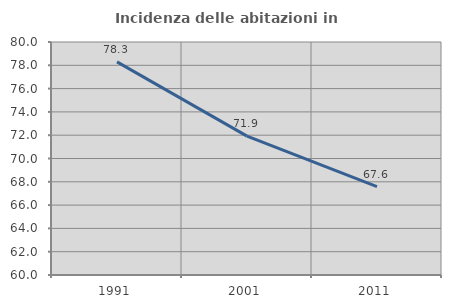
| Category | Incidenza delle abitazioni in proprietà  |
|---|---|
| 1991.0 | 78.295 |
| 2001.0 | 71.922 |
| 2011.0 | 67.587 |